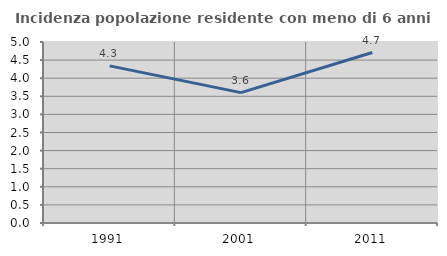
| Category | Incidenza popolazione residente con meno di 6 anni |
|---|---|
| 1991.0 | 4.341 |
| 2001.0 | 3.602 |
| 2011.0 | 4.709 |